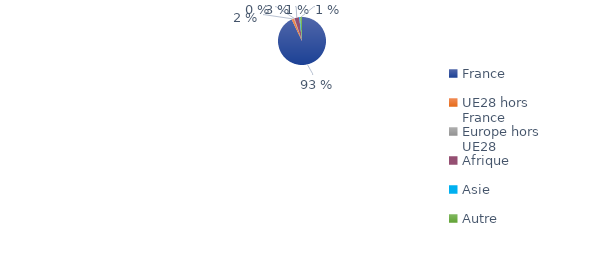
| Category | Series 0 |
|---|---|
| France | 0.929 |
| UE28 hors France | 0.016 |
| Europe hors UE28 | 0.004 |
| Afrique | 0.032 |
| Asie | 0.006 |
| Autre | 0.013 |